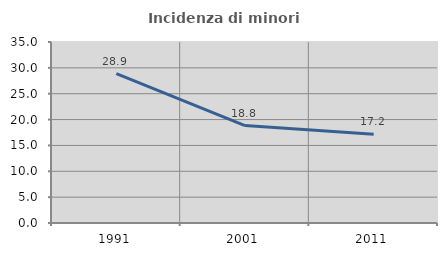
| Category | Incidenza di minori stranieri |
|---|---|
| 1991.0 | 28.889 |
| 2001.0 | 18.841 |
| 2011.0 | 17.153 |